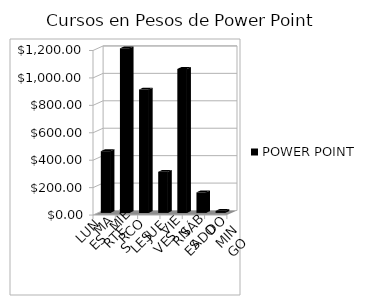
| Category | POWER POINT |
|---|---|
| LUNES | 450 |
| MARTES | 1200 |
| MIÉRCOLES | 900 |
| JUEVES | 300 |
| VIERNES | 1050 |
| SÁBADO | 150 |
| DOMINGO | 15 |